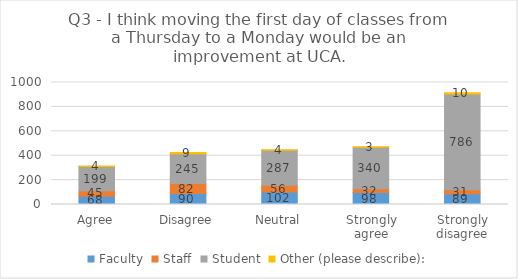
| Category | Faculty | Staff | Student | Other (please describe): |
|---|---|---|---|---|
| Agree | 68 | 45 | 199 | 4 |
| Disagree | 90 | 82 | 245 | 9 |
| Neutral | 102 | 56 | 287 | 4 |
| Strongly agree | 98 | 32 | 340 | 3 |
| Strongly disagree | 89 | 31 | 786 | 10 |